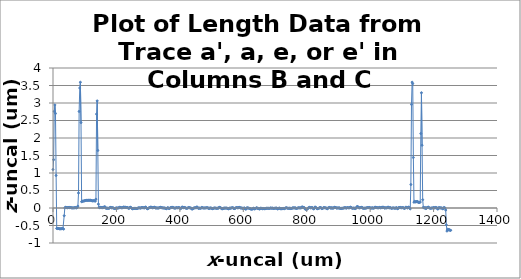
| Category | z-uncal    um |
|---|---|
| 0.0 | 1.1 |
| 1.96246 | 1.38 |
| 3.9249300000000003 | 2.759 |
| 5.88739 | 2.945 |
| 7.84985 | 2.701 |
| 9.81232 | 0.929 |
| 11.7748 | -0.583 |
| 13.7372 | -0.589 |
| 15.6997 | -0.579 |
| 17.6622 | -0.585 |
| 19.624599999999997 | -0.591 |
| 21.587100000000003 | -0.597 |
| 23.5496 | -0.594 |
| 25.512 | -0.59 |
| 27.4745 | -0.592 |
| 29.437 | -0.585 |
| 31.3994 | -0.589 |
| 33.3619 | -0.604 |
| 35.3243 | -0.22 |
| 37.2868 | 0.003 |
| 39.2493 | 0.02 |
| 41.2117 | 0.012 |
| 43.174200000000006 | 0.013 |
| 45.136700000000005 | 0.006 |
| 47.0991 | 0.013 |
| 49.0616 | 0.015 |
| 51.024 | 0.018 |
| 52.9865 | 0.008 |
| 54.949 | 0.013 |
| 56.9114 | 0.012 |
| 58.8739 | 0.003 |
| 60.8364 | 0.003 |
| 62.7988 | 0.004 |
| 64.76129999999999 | 0.004 |
| 66.7238 | 0.002 |
| 68.6862 | 0.011 |
| 70.64869999999999 | 0.014 |
| 72.6111 | 0.002 |
| 74.5736 | 0.005 |
| 76.53609999999999 | 0.018 |
| 78.49849999999999 | 0.053 |
| 80.461 | 0.429 |
| 82.42349999999999 | 2.758 |
| 84.3859 | 3.428 |
| 86.34840000000001 | 3.593 |
| 88.3109 | 2.44 |
| 90.2733 | 0.18 |
| 92.23580000000001 | 0.192 |
| 94.1982 | 0.195 |
| 96.1607 | 0.198 |
| 98.1232 | 0.202 |
| 100.086 | 0.208 |
| 102.048 | 0.214 |
| 104.01100000000001 | 0.218 |
| 105.973 | 0.219 |
| 107.935 | 0.219 |
| 109.898 | 0.217 |
| 111.86 | 0.221 |
| 113.823 | 0.219 |
| 115.785 | 0.22 |
| 117.748 | 0.222 |
| 119.71 | 0.219 |
| 121.673 | 0.212 |
| 123.63499999999999 | 0.204 |
| 125.59799999999998 | 0.205 |
| 127.56 | 0.207 |
| 129.523 | 0.212 |
| 131.48499999999999 | 0.204 |
| 133.448 | 0.196 |
| 135.41 | 0.252 |
| 137.37199999999999 | 2.683 |
| 139.33499999999998 | 3.061 |
| 141.297 | 1.644 |
| 143.26 | 0.11 |
| 145.22199999999998 | 0.023 |
| 147.185 | 0.009 |
| 149.147 | 0.013 |
| 151.10999999999999 | 0.021 |
| 153.072 | 0.012 |
| 155.035 | 0.006 |
| 156.99699999999999 | 0.016 |
| 158.95999999999998 | 0.014 |
| 160.922 | 0.03 |
| 162.88400000000001 | 0.035 |
| 164.84699999999998 | 0.025 |
| 166.80900000000003 | -0.008 |
| 168.772 | -0.006 |
| 170.734 | -0.011 |
| 172.697 | -0.002 |
| 174.65900000000002 | -0.01 |
| 176.622 | -0.01 |
| 178.584 | 0.006 |
| 180.54700000000003 | 0.017 |
| 182.50900000000001 | 0.018 |
| 184.472 | 0.003 |
| 186.434 | 0.009 |
| 188.39600000000002 | 0.006 |
| 190.359 | 0.003 |
| 192.321 | -0.011 |
| 194.28400000000002 | -0.015 |
| 196.246 | -0.012 |
| 198.209 | -0.003 |
| 200.171 | 0.005 |
| 202.13400000000001 | -0.005 |
| 204.096 | -0.002 |
| 206.059 | 0.005 |
| 208.02100000000002 | 0.003 |
| 209.984 | 0.019 |
| 211.946 | 0.014 |
| 213.909 | 0.016 |
| 215.871 | 0.004 |
| 217.833 | 0.007 |
| 219.796 | 0.009 |
| 221.758 | 0.026 |
| 223.721 | 0.023 |
| 225.683 | 0.019 |
| 227.646 | 0.023 |
| 229.608 | 0.017 |
| 231.571 | 0.013 |
| 233.533 | 0.018 |
| 235.496 | 0.011 |
| 237.458 | -0.005 |
| 239.421 | -0.011 |
| 241.38299999999998 | 0.003 |
| 243.345 | 0.023 |
| 245.308 | 0.017 |
| 247.26999999999998 | 0 |
| 249.233 | -0.014 |
| 251.195 | -0.024 |
| 253.158 | -0.013 |
| 255.12 | -0.017 |
| 257.083 | -0.011 |
| 259.045 | -0.012 |
| 261.00800000000004 | -0.011 |
| 262.96999999999997 | -0.014 |
| 264.933 | -0.016 |
| 266.895 | -0.006 |
| 268.857 | -0.004 |
| 270.82 | 0.01 |
| 272.78200000000004 | 0.002 |
| 274.745 | 0.003 |
| 276.707 | -0.005 |
| 278.66999999999996 | 0.011 |
| 280.632 | 0.016 |
| 282.59499999999997 | 0.009 |
| 284.557 | 0.008 |
| 286.52 | 0.007 |
| 288.482 | 0.001 |
| 290.445 | 0.022 |
| 292.407 | 0.026 |
| 294.37 | 0.006 |
| 296.332 | -0.015 |
| 298.294 | -0.023 |
| 300.257 | -0.01 |
| 302.219 | 0.002 |
| 304.182 | 0.011 |
| 306.144 | 0.016 |
| 308.107 | 0.025 |
| 310.06899999999996 | 0.02 |
| 312.032 | 0.013 |
| 313.99399999999997 | 0.005 |
| 315.957 | 0.012 |
| 317.919 | 0.014 |
| 319.882 | 0.023 |
| 321.844 | 0.013 |
| 323.806 | -0.003 |
| 325.76899999999995 | -0.001 |
| 327.731 | 0.006 |
| 329.69399999999996 | -0.004 |
| 331.656 | -0.002 |
| 333.61899999999997 | 0.001 |
| 335.581 | 0.011 |
| 337.544 | 0.016 |
| 339.506 | 0.02 |
| 341.46900000000005 | 0.009 |
| 343.431 | 0.01 |
| 345.394 | 0.004 |
| 347.356 | -0.002 |
| 349.31800000000004 | 0.002 |
| 351.281 | 0.003 |
| 353.243 | -0.009 |
| 355.206 | -0.007 |
| 357.168 | -0.021 |
| 359.131 | -0.012 |
| 361.093 | 0.008 |
| 363.056 | 0.006 |
| 365.01800000000003 | -0.012 |
| 366.981 | -0.013 |
| 368.94300000000004 | -0.001 |
| 370.906 | 0.011 |
| 372.868 | 0.014 |
| 374.831 | 0.017 |
| 376.793 | 0.017 |
| 378.755 | 0.013 |
| 380.718 | 0.005 |
| 382.68 | -0.005 |
| 384.64300000000003 | -0.002 |
| 386.60499999999996 | -0.004 |
| 388.56800000000004 | 0.011 |
| 390.53 | 0.007 |
| 392.493 | 0.004 |
| 394.455 | 0.006 |
| 396.418 | 0.013 |
| 398.38 | 0.007 |
| 400.343 | -0.001 |
| 402.305 | -0.021 |
| 404.267 | -0.002 |
| 406.22999999999996 | 0.02 |
| 408.192 | 0.026 |
| 410.155 | 0.015 |
| 412.117 | 0.007 |
| 414.08 | 0.015 |
| 416.04200000000003 | 0.012 |
| 418.005 | 0.003 |
| 419.967 | -0.01 |
| 421.93 | -0.009 |
| 423.892 | -0.005 |
| 425.85499999999996 | 0.004 |
| 427.817 | 0.014 |
| 429.779 | 0.01 |
| 431.742 | 0.004 |
| 433.70399999999995 | 0.003 |
| 435.66700000000003 | -0.007 |
| 437.62899999999996 | -0.027 |
| 439.592 | -0.031 |
| 441.554 | -0.017 |
| 443.517 | -0.004 |
| 445.47900000000004 | 0.006 |
| 447.442 | 0.003 |
| 449.40400000000005 | 0.009 |
| 451.367 | 0.005 |
| 453.329 | 0.03 |
| 455.292 | 0.021 |
| 457.254 | 0.001 |
| 459.216 | -0.013 |
| 461.17900000000003 | -0.003 |
| 463.141 | -0.005 |
| 465.10400000000004 | -0.01 |
| 467.066 | -0.002 |
| 469.029 | 0.017 |
| 470.991 | 0.011 |
| 472.954 | 0 |
| 474.916 | -0.002 |
| 476.879 | 0.004 |
| 478.841 | -0.003 |
| 480.80400000000003 | 0.002 |
| 482.76599999999996 | 0.007 |
| 484.728 | 0.007 |
| 486.691 | 0.007 |
| 488.653 | 0.006 |
| 490.616 | -0.012 |
| 492.57800000000003 | -0.014 |
| 494.541 | -0.001 |
| 496.50300000000004 | 0.004 |
| 498.466 | -0.009 |
| 500.428 | -0.004 |
| 502.391 | -0.02 |
| 504.35300000000007 | -0.014 |
| 506.316 | -0.008 |
| 508.278 | 0 |
| 510.24 | 0.001 |
| 512.203 | -0.003 |
| 514.165 | -0.006 |
| 516.128 | -0.01 |
| 518.09 | -0.009 |
| 520.053 | -0.003 |
| 522.015 | -0.005 |
| 523.9780000000001 | 0.019 |
| 525.9399999999999 | 0.016 |
| 527.903 | 0.01 |
| 529.865 | -0.003 |
| 531.828 | -0.018 |
| 533.79 | -0.022 |
| 535.753 | -0.021 |
| 537.715 | -0.011 |
| 539.6769999999999 | 0.002 |
| 541.64 | -0.008 |
| 543.602 | -0.002 |
| 545.5649999999999 | -0.002 |
| 547.5269999999999 | -0.002 |
| 549.49 | -0.01 |
| 551.452 | -0.015 |
| 553.415 | -0.024 |
| 555.377 | -0.012 |
| 557.3399999999999 | -0.001 |
| 559.302 | -0.011 |
| 561.265 | 0.004 |
| 563.2270000000001 | 0.001 |
| 565.1890000000001 | 0.008 |
| 567.152 | 0.01 |
| 569.114 | -0.007 |
| 571.077 | -0.019 |
| 573.039 | -0.01 |
| 575.0020000000001 | -0.008 |
| 576.964 | 0.01 |
| 578.927 | 0.012 |
| 580.889 | 0.009 |
| 582.8520000000001 | 0.003 |
| 584.814 | 0.01 |
| 586.777 | 0.02 |
| 588.739 | 0.014 |
| 590.701 | 0.004 |
| 592.664 | -0.001 |
| 594.626 | 0.003 |
| 596.589 | -0.008 |
| 598.551 | -0.009 |
| 600.514 | -0.014 |
| 602.476 | 0.004 |
| 604.439 | -0.006 |
| 606.401 | -0.026 |
| 608.364 | -0.033 |
| 610.326 | -0.007 |
| 612.289 | 0.009 |
| 614.251 | -0.004 |
| 616.213 | 0.001 |
| 618.1759999999999 | -0.009 |
| 620.1379999999999 | -0.013 |
| 622.101 | -0.022 |
| 624.063 | -0.032 |
| 626.026 | -0.035 |
| 627.9879999999999 | -0.026 |
| 629.951 | -0.031 |
| 631.9129999999999 | -0.005 |
| 633.876 | -0.011 |
| 635.838 | -0.029 |
| 637.8009999999999 | -0.016 |
| 639.7629999999999 | -0.01 |
| 641.726 | 0.01 |
| 643.688 | 0 |
| 645.65 | -0.013 |
| 647.6129999999999 | -0.012 |
| 649.575 | -0.024 |
| 651.5379999999999 | -0.031 |
| 653.5 | -0.011 |
| 655.463 | -0.004 |
| 657.4250000000001 | -0.012 |
| 659.3879999999999 | -0.013 |
| 661.35 | -0.023 |
| 663.313 | -0.014 |
| 665.275 | -0.018 |
| 667.2379999999999 | -0.021 |
| 669.2 | -0.016 |
| 671.162 | -0.015 |
| 673.125 | -0.007 |
| 675.087 | -0.009 |
| 677.0500000000001 | -0.008 |
| 679.012 | -0.008 |
| 680.975 | -0.013 |
| 682.937 | -0.011 |
| 684.9 | -0.004 |
| 686.862 | 0.004 |
| 688.825 | -0.011 |
| 690.787 | -0.003 |
| 692.75 | -0.005 |
| 694.712 | -0.012 |
| 696.674 | -0.012 |
| 698.637 | -0.009 |
| 700.5989999999999 | -0.005 |
| 702.562 | -0.007 |
| 704.524 | 0.002 |
| 706.487 | -0.013 |
| 708.449 | -0.028 |
| 710.412 | -0.015 |
| 712.3739999999999 | -0.007 |
| 714.337 | -0.001 |
| 716.299 | -0.019 |
| 718.262 | -0.021 |
| 720.2239999999999 | -0.022 |
| 722.187 | -0.013 |
| 724.149 | -0.017 |
| 726.111 | -0.015 |
| 728.074 | -0.011 |
| 730.0360000000001 | -0.019 |
| 731.9989999999999 | -0.004 |
| 733.961 | 0.001 |
| 735.924 | 0.009 |
| 737.8860000000001 | 0 |
| 739.8489999999999 | -0.008 |
| 741.811 | -0.009 |
| 743.774 | -0.009 |
| 745.736 | -0.004 |
| 747.699 | -0.017 |
| 749.6610000000001 | -0.008 |
| 751.623 | -0.012 |
| 753.586 | -0.012 |
| 755.548 | 0.005 |
| 757.5110000000001 | 0.005 |
| 759.473 | 0.002 |
| 761.436 | 0 |
| 763.398 | 0.009 |
| 765.361 | -0.009 |
| 767.323 | -0.012 |
| 769.2860000000001 | -0.007 |
| 771.248 | -0.003 |
| 773.211 | 0.002 |
| 775.173 | 0.009 |
| 777.135 | 0.003 |
| 779.098 | 0.003 |
| 781.06 | 0.002 |
| 783.023 | 0.008 |
| 784.985 | 0.03 |
| 786.948 | 0.028 |
| 788.91 | 0.015 |
| 790.873 | 0.013 |
| 792.8349999999999 | 0.007 |
| 794.798 | -0.027 |
| 796.76 | -0.032 |
| 798.723 | -0.046 |
| 800.685 | -0.035 |
| 802.648 | -0.019 |
| 804.61 | 0 |
| 806.572 | 0.007 |
| 808.535 | 0.018 |
| 810.4970000000001 | 0.012 |
| 812.4599999999999 | 0.002 |
| 814.422 | 0.009 |
| 816.385 | 0.013 |
| 818.3470000000001 | 0.008 |
| 820.31 | -0.014 |
| 822.272 | -0.027 |
| 824.235 | 0.001 |
| 826.197 | 0.028 |
| 828.16 | 0.019 |
| 830.1220000000001 | 0.003 |
| 832.0840000000001 | -0.016 |
| 834.047 | -0.02 |
| 836.009 | -0.01 |
| 837.9720000000001 | -0.01 |
| 839.934 | 0.001 |
| 841.897 | 0.018 |
| 843.859 | 0.01 |
| 845.822 | 0.003 |
| 847.784 | -0.019 |
| 849.7470000000001 | -0.014 |
| 851.7090000000001 | 0.001 |
| 853.672 | 0.012 |
| 855.634 | 0.011 |
| 857.596 | 0.003 |
| 859.559 | 0.006 |
| 861.521 | -0.002 |
| 863.484 | -0.014 |
| 865.446 | -0.021 |
| 867.409 | 0.005 |
| 869.371 | 0.004 |
| 871.3340000000001 | 0.016 |
| 873.2959999999999 | 0.013 |
| 875.259 | -0.002 |
| 877.221 | -0.007 |
| 879.184 | 0.012 |
| 881.146 | -0.007 |
| 883.109 | -0.001 |
| 885.071 | -0.002 |
| 887.033 | 0.02 |
| 888.996 | 0.019 |
| 890.9580000000001 | 0.014 |
| 892.9209999999999 | 0.006 |
| 894.883 | -0.006 |
| 896.846 | 0.003 |
| 898.8080000000001 | 0.004 |
| 900.771 | -0.003 |
| 902.7330000000001 | 0.007 |
| 904.6959999999999 | -0.011 |
| 906.658 | -0.011 |
| 908.621 | -0.013 |
| 910.5830000000001 | -0.008 |
| 912.5450000000001 | -0.007 |
| 914.508 | -0.009 |
| 916.47 | 0.003 |
| 918.4330000000001 | 0.003 |
| 920.395 | 0.012 |
| 922.3580000000001 | 0.008 |
| 924.32 | -0.005 |
| 926.283 | 0.003 |
| 928.245 | 0.012 |
| 930.2080000000001 | 0.007 |
| 932.1700000000001 | 0.005 |
| 934.133 | 0.004 |
| 936.095 | 0.013 |
| 938.057 | 0.025 |
| 940.02 | 0.008 |
| 941.982 | 0.006 |
| 943.945 | -0.01 |
| 945.907 | -0.009 |
| 947.87 | 0.001 |
| 949.832 | -0.005 |
| 951.795 | -0.013 |
| 953.757 | -0.016 |
| 955.72 | -0.002 |
| 957.682 | 0.03 |
| 959.645 | 0.042 |
| 961.607 | 0.035 |
| 963.57 | 0.013 |
| 965.5319999999999 | 0.001 |
| 967.4939999999999 | 0.008 |
| 969.457 | 0.012 |
| 971.419 | 0.017 |
| 973.382 | 0.019 |
| 975.3439999999999 | 0.012 |
| 977.307 | -0.01 |
| 979.2689999999999 | -0.008 |
| 981.232 | -0.001 |
| 983.194 | -0.011 |
| 985.1569999999999 | -0.002 |
| 987.1189999999999 | -0.003 |
| 989.082 | 0.004 |
| 991.044 | 0.011 |
| 993.0060000000001 | 0.008 |
| 994.9689999999999 | 0.011 |
| 996.931 | 0.009 |
| 998.894 | 0.015 |
| 1000.8600000000001 | -0.005 |
| 1002.82 | -0.006 |
| 1004.78 | 0.001 |
| 1006.74 | 0.01 |
| 1008.71 | -0.009 |
| 1010.67 | -0.003 |
| 1012.6299999999999 | -0.001 |
| 1014.5900000000001 | 0.019 |
| 1016.56 | 0.021 |
| 1018.5200000000001 | 0.017 |
| 1020.48 | 0.011 |
| 1022.44 | 0.007 |
| 1024.41 | 0.007 |
| 1026.37 | 0.004 |
| 1028.33 | 0.01 |
| 1030.29 | 0.019 |
| 1032.26 | 0.005 |
| 1034.22 | 0.005 |
| 1036.18 | 0.016 |
| 1038.14 | 0.023 |
| 1040.1100000000001 | 0.009 |
| 1042.0700000000002 | 0.02 |
| 1044.03 | 0.011 |
| 1045.99 | -0.005 |
| 1047.96 | 0.006 |
| 1049.92 | 0.007 |
| 1051.8799999999999 | 0.001 |
| 1053.8400000000001 | 0.009 |
| 1055.81 | 0.021 |
| 1057.7700000000002 | 0.021 |
| 1059.73 | 0.002 |
| 1061.69 | 0.008 |
| 1063.66 | 0.011 |
| 1065.6200000000001 | 0.002 |
| 1067.58 | -0.012 |
| 1069.54 | -0.003 |
| 1071.51 | 0.002 |
| 1073.47 | 0.004 |
| 1075.43 | -0.001 |
| 1077.39 | -0.007 |
| 1079.3500000000001 | -0.007 |
| 1081.3200000000002 | 0.001 |
| 1083.28 | 0.012 |
| 1085.24 | -0.015 |
| 1087.2 | -0.021 |
| 1089.17 | 0.004 |
| 1091.1299999999999 | 0.016 |
| 1093.09 | 0.011 |
| 1095.0500000000002 | 0.017 |
| 1097.0200000000002 | 0.006 |
| 1098.98 | 0.005 |
| 1100.94 | 0.011 |
| 1102.9 | 0.009 |
| 1104.8700000000001 | 0.01 |
| 1106.83 | -0.011 |
| 1108.79 | -0.011 |
| 1110.75 | 0.005 |
| 1112.72 | 0.023 |
| 1114.6799999999998 | 0.016 |
| 1116.64 | 0.004 |
| 1118.6000000000001 | 0.002 |
| 1120.5700000000002 | 0.023 |
| 1122.53 | 0.023 |
| 1124.49 | -0.002 |
| 1126.45 | -0.025 |
| 1128.42 | 0.67 |
| 1130.3799999999999 | 2.96 |
| 1132.34 | 3.595 |
| 1134.3000000000002 | 3.554 |
| 1136.27 | 1.443 |
| 1138.23 | 0.164 |
| 1140.19 | 0.189 |
| 1142.15 | 0.177 |
| 1144.1200000000001 | 0.173 |
| 1146.08 | 0.184 |
| 1148.04 | 0.189 |
| 1150.0 | 0.18 |
| 1151.97 | 0.162 |
| 1153.9299999999998 | 0.156 |
| 1155.89 | 0.159 |
| 1157.8500000000001 | 0.17 |
| 1159.8200000000002 | 2.127 |
| 1161.78 | 3.292 |
| 1163.74 | 1.792 |
| 1165.7 | 0.237 |
| 1167.67 | 0.018 |
| 1169.6299999999999 | 0.006 |
| 1171.59 | 0 |
| 1173.5500000000002 | 0.014 |
| 1175.52 | -0.017 |
| 1177.48 | -0.007 |
| 1179.44 | 0.013 |
| 1181.4 | 0.015 |
| 1183.3700000000001 | 0.026 |
| 1185.33 | 0.01 |
| 1187.29 | -0.003 |
| 1189.25 | -0.005 |
| 1191.22 | -0.011 |
| 1193.1799999999998 | 0 |
| 1195.14 | 0 |
| 1197.1000000000001 | 0.002 |
| 1199.0700000000002 | 0.004 |
| 1201.03 | 0.016 |
| 1202.99 | 0.002 |
| 1204.95 | 0.005 |
| 1206.9099999999999 | 0.016 |
| 1208.8799999999999 | 0.007 |
| 1210.84 | 0.005 |
| 1212.8000000000002 | -0.031 |
| 1214.76 | -0.019 |
| 1216.73 | 0.013 |
| 1218.69 | 0.007 |
| 1220.65 | -0.001 |
| 1222.61 | 0.007 |
| 1224.58 | -0.002 |
| 1226.54 | 0 |
| 1228.5 | -0.021 |
| 1230.46 | -0.017 |
| 1232.4299999999998 | 0.012 |
| 1234.39 | 0.008 |
| 1236.3500000000001 | -0.003 |
| 1238.31 | -0.058 |
| 1240.28 | -0.483 |
| 1242.24 | -0.659 |
| 1244.2 | -0.607 |
| 1246.1599999999999 | -0.625 |
| 1248.1299999999999 | -0.613 |
| 1250.09 | -0.625 |
| 1252.0500000000002 | -0.64 |
| 1254.01 | -0.637 |